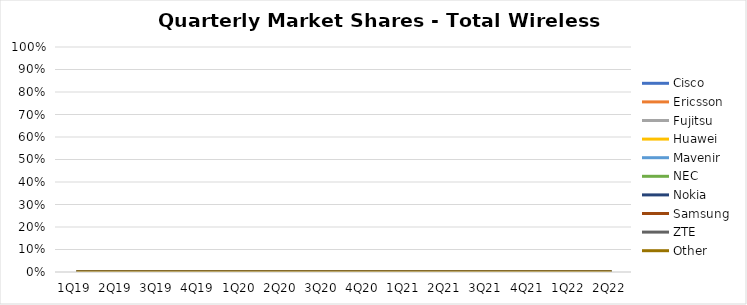
| Category | Cisco | Ericsson | Fujitsu | Huawei | Mavenir | NEC | Nokia | Samsung | ZTE | Other |
|---|---|---|---|---|---|---|---|---|---|---|
| 1Q19 | 0 | 0 | 0 | 0 | 0 | 0 | 0 | 0 | 0 | 0 |
| 2Q19 | 0 | 0 | 0 | 0 | 0 | 0 | 0 | 0 | 0 | 0 |
| 3Q19 | 0 | 0 | 0 | 0 | 0 | 0 | 0 | 0 | 0 | 0 |
| 4Q19 | 0 | 0 | 0 | 0 | 0 | 0 | 0 | 0 | 0 | 0 |
| 1Q20 | 0 | 0 | 0 | 0 | 0 | 0 | 0 | 0 | 0 | 0 |
| 2Q20 | 0 | 0 | 0 | 0 | 0 | 0 | 0 | 0 | 0 | 0 |
| 3Q20 | 0 | 0 | 0 | 0 | 0 | 0 | 0 | 0 | 0 | 0 |
| 4Q20 | 0 | 0 | 0 | 0 | 0 | 0 | 0 | 0 | 0 | 0 |
| 1Q21 | 0 | 0 | 0 | 0 | 0 | 0 | 0 | 0 | 0 | 0 |
| 2Q21 | 0 | 0 | 0 | 0 | 0 | 0 | 0 | 0 | 0 | 0 |
| 3Q21 | 0 | 0 | 0 | 0 | 0 | 0 | 0 | 0 | 0 | 0 |
| 4Q21 | 0 | 0 | 0 | 0 | 0 | 0 | 0 | 0 | 0 | 0 |
| 1Q22 | 0 | 0 | 0 | 0 | 0 | 0 | 0 | 0 | 0 | 0 |
| 2Q22 | 0 | 0 | 0 | 0 | 0 | 0 | 0 | 0 | 0 | 0 |